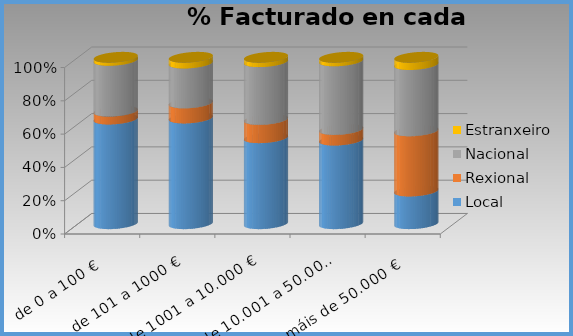
| Category | Local | Rexional | Nacional | Estranxeiro |
|---|---|---|---|---|
| de 0 a 100 € | 0.629 | 0.048 | 0.305 | 0.019 |
| de 101 a 1000 € | 0.635 | 0.091 | 0.239 | 0.035 |
| de 1001 a 10.000 € | 0.517 | 0.11 | 0.347 | 0.027 |
| de 10.001 a 50.000 € | 0.502 | 0.064 | 0.412 | 0.022 |
| máis de 50.000 € | 0.196 | 0.362 | 0.398 | 0.044 |